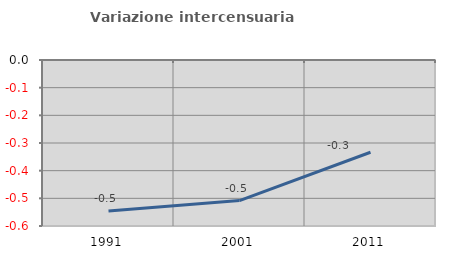
| Category | Variazione intercensuaria annua |
|---|---|
| 1991.0 | -0.546 |
| 2001.0 | -0.508 |
| 2011.0 | -0.333 |